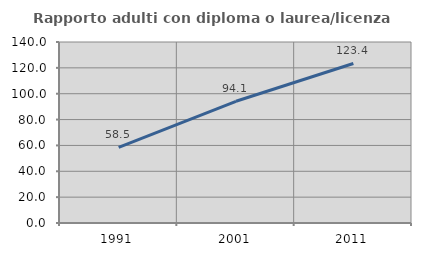
| Category | Rapporto adulti con diploma o laurea/licenza media  |
|---|---|
| 1991.0 | 58.549 |
| 2001.0 | 94.146 |
| 2011.0 | 123.394 |